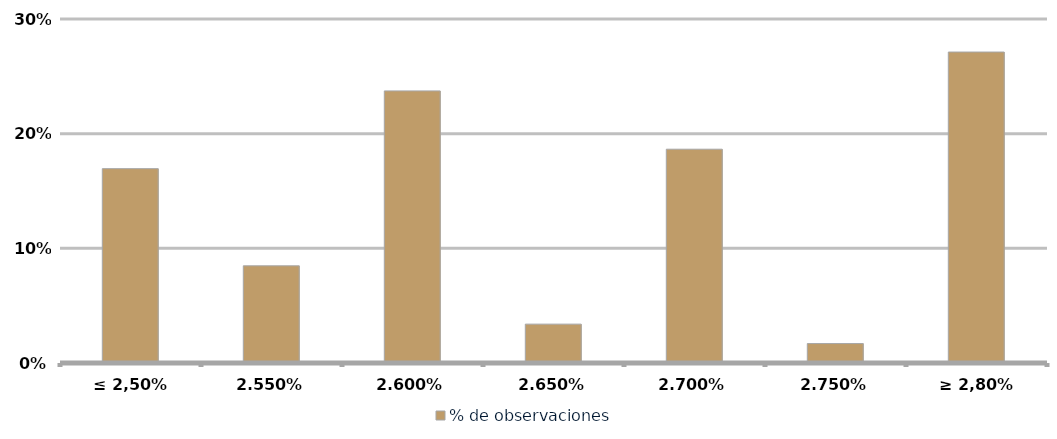
| Category | % de observaciones  |
|---|---|
| ≤ 2,50% | 0.169 |
| 2.55% | 0.085 |
| 2.60% | 0.237 |
| 2.65% | 0.034 |
| 2.70% | 0.186 |
| 2.75% | 0.017 |
| ≥ 2,80% | 0.271 |